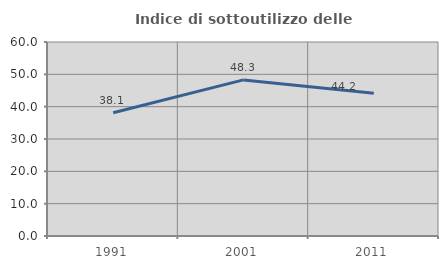
| Category | Indice di sottoutilizzo delle abitazioni  |
|---|---|
| 1991.0 | 38.104 |
| 2001.0 | 48.276 |
| 2011.0 | 44.152 |